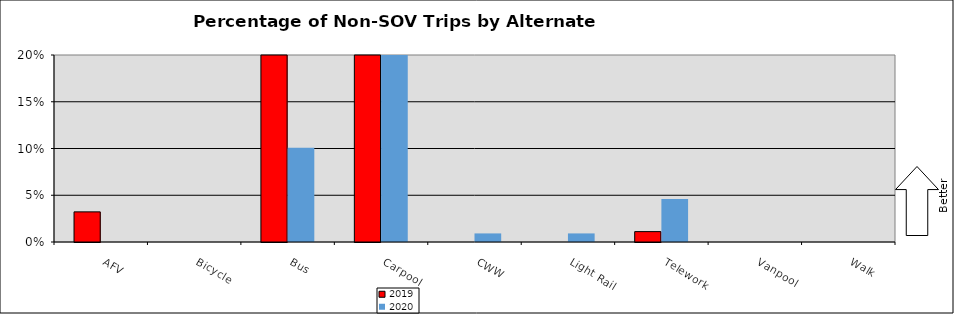
| Category | 2019 | 2020 |
|---|---|---|
| AFV | 0.032 | 0 |
| Bicycle | 0 | 0 |
| Bus | 0.222 | 0.101 |
| Carpool | 0.244 | 0.33 |
| CWW | 0 | 0.009 |
| Light Rail | 0 | 0.009 |
| Telework | 0.011 | 0.046 |
| Vanpool | 0 | 0 |
| Walk | 0 | 0 |